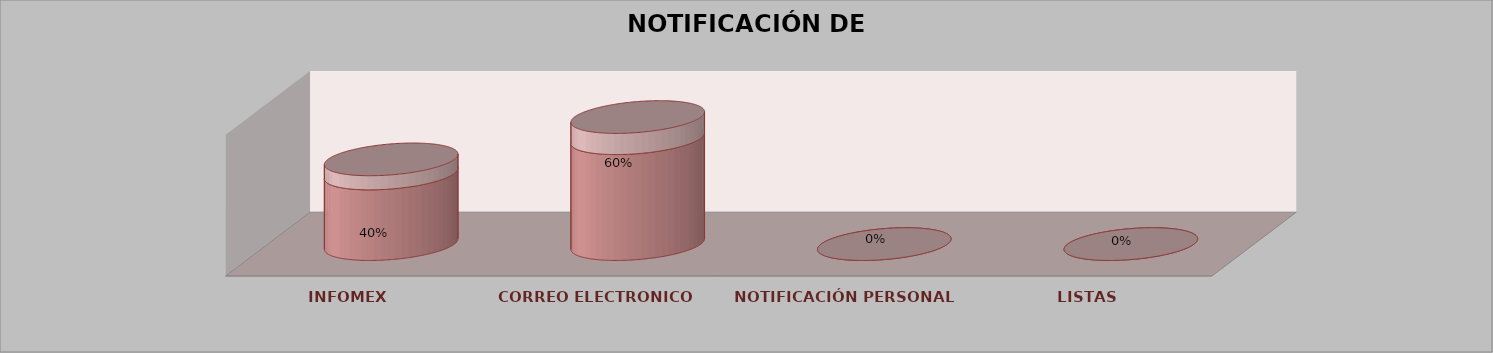
| Category | Series 0 | Series 1 | Series 2 | Series 3 | Series 4 |
|---|---|---|---|---|---|
| INFOMEX |  |  |  | 2 | 0.4 |
| CORREO ELECTRONICO |  |  |  | 3 | 0.6 |
| NOTIFICACIÓN PERSONAL |  |  |  | 0 | 0 |
| LISTAS |  |  |  | 0 | 0 |